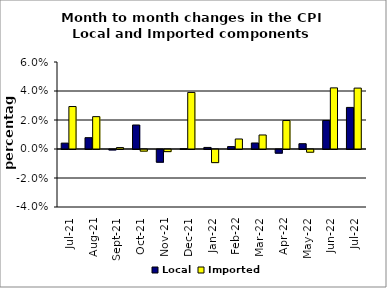
| Category | Local | Imported |
|---|---|---|
| 2021-07-01 | 0.004 | 0.029 |
| 2021-08-01 | 0.008 | 0.022 |
| 2021-09-01 | 0 | 0.001 |
| 2021-10-01 | 0.017 | -0.001 |
| 2021-11-01 | -0.009 | -0.001 |
| 2021-12-01 | 0 | 0.039 |
| 2022-01-01 | 0.001 | -0.009 |
| 2022-02-01 | 0.002 | 0.007 |
| 2022-03-01 | 0.004 | 0.01 |
| 2022-04-01 | -0.003 | 0.02 |
| 2022-05-01 | 0.004 | -0.002 |
| 2022-06-01 | 0.02 | 0.042 |
| 2022-07-01 | 0.029 | 0.042 |